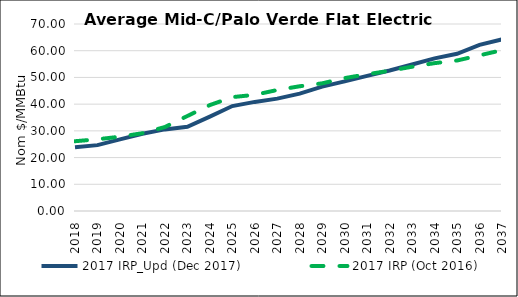
| Category | 2017 IRP_Upd (Dec 2017) | 2017 IRP (Oct 2016) |
|---|---|---|
| 2018.0 | 23.867 | 26.117 |
| 2019.0 | 24.659 | 26.847 |
| 2020.0 | 26.794 | 27.814 |
| 2021.0 | 28.936 | 29.121 |
| 2022.0 | 30.546 | 31.438 |
| 2023.0 | 31.545 | 35.557 |
| 2024.0 | 35.351 | 39.651 |
| 2025.0 | 39.288 | 42.624 |
| 2026.0 | 40.837 | 43.491 |
| 2027.0 | 42.062 | 45.289 |
| 2028.0 | 43.929 | 46.695 |
| 2029.0 | 46.55 | 47.789 |
| 2030.0 | 48.534 | 49.749 |
| 2031.0 | 50.577 | 51.198 |
| 2032.0 | 52.616 | 52.49 |
| 2033.0 | 54.855 | 54.006 |
| 2034.0 | 57.128 | 55.35 |
| 2035.0 | 58.862 | 56.335 |
| 2036.0 | 62.205 | 58.271 |
| 2037.0 | 64.239 | 60.204 |